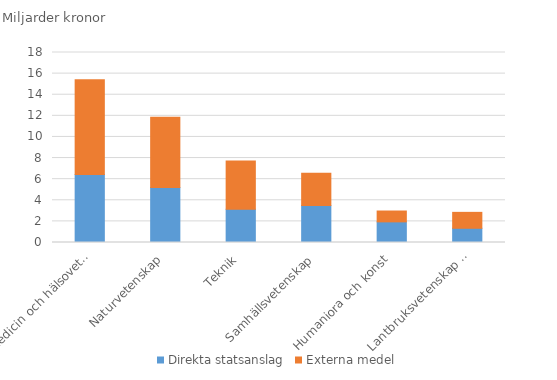
| Category | Direkta statsanslag | Externa medel |
|---|---|---|
| Medicin och hälsovetenskap | 6.448 | 8.964 |
| Naturvetenskap | 5.206 | 6.653 |
| Teknik | 3.141 | 4.583 |
| Samhällsvetenskap | 3.51 | 3.063 |
| Humaniora och konst | 1.954 | 1.028 |
| Lantbruksvetenskap och veterinärmedicin | 1.348 | 1.507 |